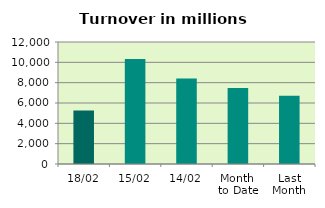
| Category | Series 0 |
|---|---|
| 18/02 | 5262.611 |
| 15/02 | 10336.222 |
| 14/02 | 8402.251 |
| Month 
to Date | 7481.153 |
| Last
Month | 6707.699 |